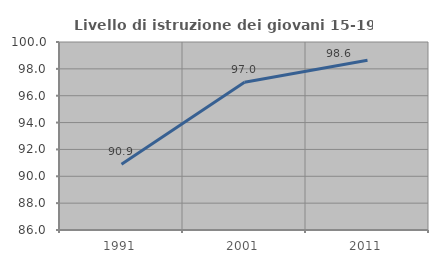
| Category | Livello di istruzione dei giovani 15-19 anni |
|---|---|
| 1991.0 | 90.897 |
| 2001.0 | 96.997 |
| 2011.0 | 98.639 |